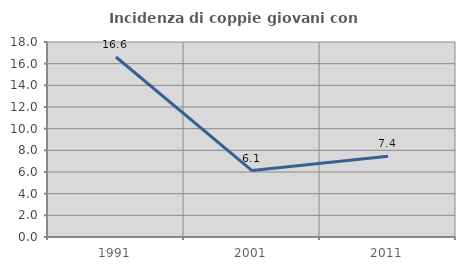
| Category | Incidenza di coppie giovani con figli |
|---|---|
| 1991.0 | 16.617 |
| 2001.0 | 6.135 |
| 2011.0 | 7.45 |